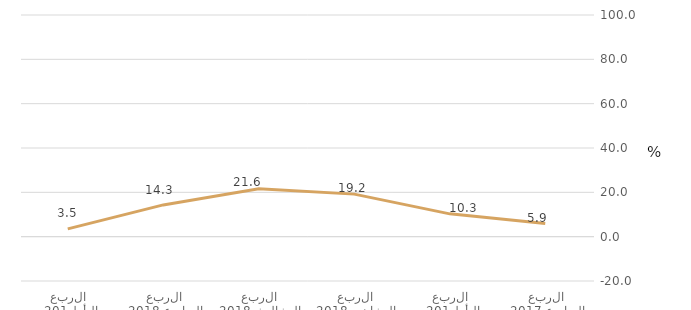
| Category | قطاع الشركات غير المالية |
|---|---|
| الربع الرابع 2017 | 5.93 |
| الربع الأول 2018 | 10.288 |
| الربع الثاني 2018 | 19.193 |
| الربع الثالث 2018 | 21.642 |
| الربع الرابع 2018 | 14.323 |
| الربع الأول 2019 | 3.522 |